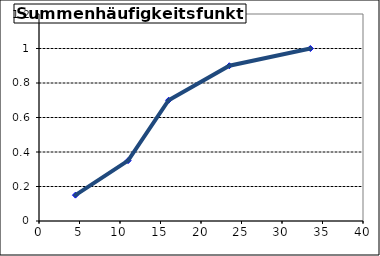
| Category | Summenhäufigkeit |
|---|---|
| 4.5 | 0.15 |
| 11.0 | 0.35 |
| 16.0 | 0.7 |
| 23.5 | 0.9 |
| 33.5 | 1 |